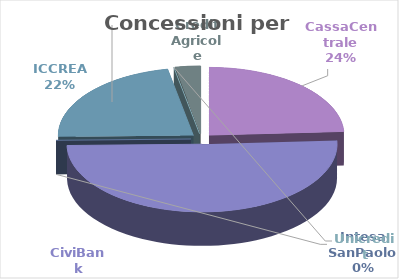
| Category | Series 0 |
|---|---|
| CassaCentrale | 24897000 |
| CiviBank | 52137765 |
| Intesa SanPaolo  | 0 |
| ICCREA | 22950000 |
| Unicredit | 0 |
| Credit Agricole | 3150000 |